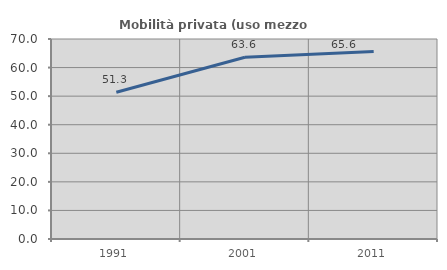
| Category | Mobilità privata (uso mezzo privato) |
|---|---|
| 1991.0 | 51.343 |
| 2001.0 | 63.611 |
| 2011.0 | 65.649 |